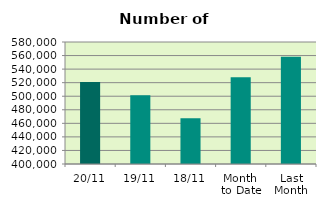
| Category | Series 0 |
|---|---|
| 20/11 | 521070 |
| 19/11 | 501314 |
| 18/11 | 467462 |
| Month 
to Date | 527994.143 |
| Last
Month | 558199.478 |